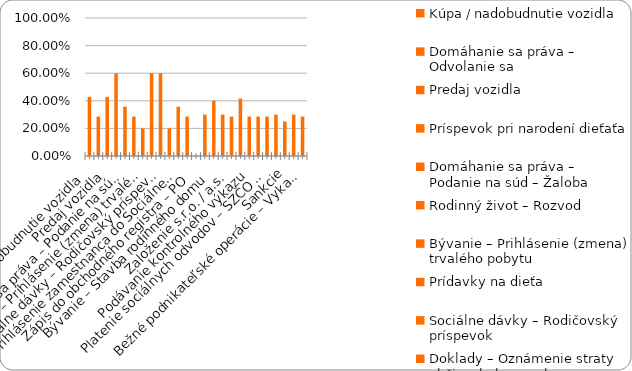
| Category | % |
|---|---|
| Kúpa / nadobudnutie vozidla | 0.429 |
| Domáhanie sa práva – Odvolanie sa | 0.286 |
| Predaj vozidla | 0.429 |
| Príspevok pri narodení dieťaťa | 0.6 |
| Domáhanie sa práva – Podanie na súd – Žaloba | 0.357 |
| Rodinný život – Rozvod | 0.286 |
| Bývanie – Prihlásenie (zmena) trvalého pobytu | 0.2 |
| Prídavky na dieťa | 0.6 |
| Sociálne dávky – Rodičovský príspevok | 0.6 |
| Doklady – Oznámenie straty občianskeho preukazu | 0.2 |
| Prihlásenie zamestnanca do Sociálnej poisťovne | 0.357 |
| Plnenie si daňových povinností – zamestnanec (FO) | 0.286 |
| Zápis do obchodného registra – PO | 0 |
| Živnosť - ukončenie | 0.3 |
| Bývanie – Stavba rodinného domu | 0.4 |
| Sociálne dávky – Príspevok v nezamestnanosti | 0.3 |
| Založenie s.r.o. / a.s. | 0.286 |
| Živnosť – založenie | 0.417 |
| Podávanie kontrolného výkazu | 0.286 |
| Plnenie si daňových povinností – SZČO / PO  | 0.286 |
| Platenie sociálnych odvodov – SZČO / PO | 0.286 |
| Živnosť - prerušenie | 0.3 |
| Sankcie | 0.25 |
| Živnosť - zmena | 0.3 |
| Bežné podnikateľské operácie – Vykazovanie štatistík | 0.286 |